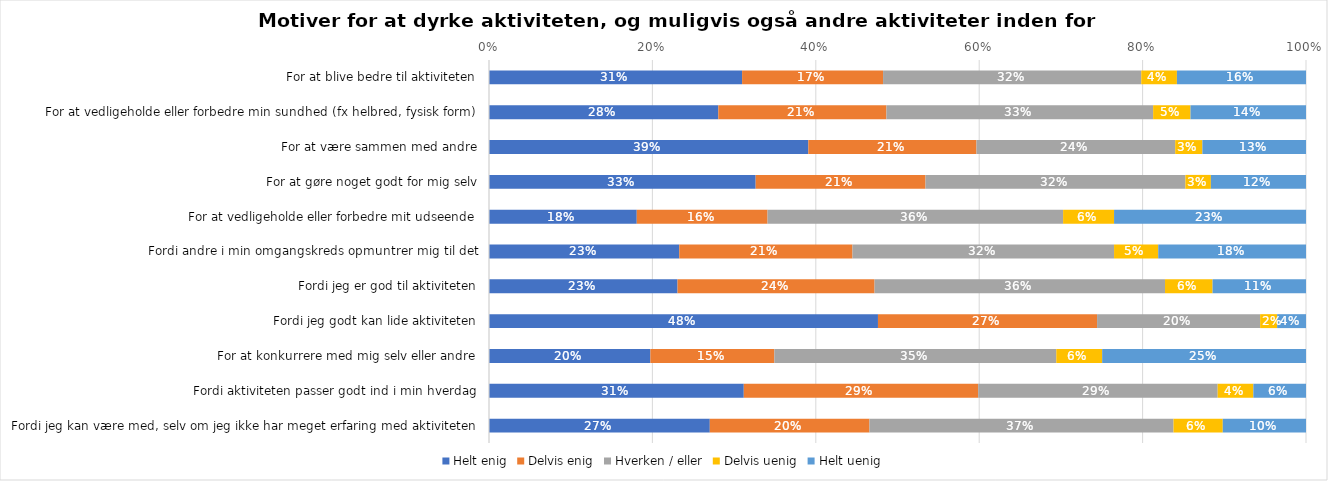
| Category | Helt enig | Delvis enig | Hverken / eller | Delvis uenig | Helt uenig |
|---|---|---|---|---|---|
| For at blive bedre til aktiviteten | 0.31 | 0.173 | 0.316 | 0.044 | 0.158 |
| For at vedligeholde eller forbedre min sundhed (fx helbred, fysisk form) | 0.281 | 0.206 | 0.326 | 0.046 | 0.141 |
| For at være sammen med andre | 0.391 | 0.206 | 0.243 | 0.033 | 0.127 |
| For at gøre noget godt for mig selv | 0.326 | 0.208 | 0.318 | 0.031 | 0.116 |
| For at vedligeholde eller forbedre mit udseende | 0.181 | 0.16 | 0.362 | 0.062 | 0.235 |
| Fordi andre i min omgangskreds opmuntrer mig til det | 0.233 | 0.212 | 0.32 | 0.054 | 0.181 |
| Fordi jeg er god til aktiviteten | 0.231 | 0.241 | 0.356 | 0.058 | 0.114 |
| Fordi jeg godt kan lide aktiviteten | 0.476 | 0.268 | 0.2 | 0.021 | 0.035 |
| For at konkurrere med mig selv eller andre | 0.198 | 0.152 | 0.345 | 0.056 | 0.249 |
| Fordi aktiviteten passer godt ind i min hverdag | 0.312 | 0.287 | 0.293 | 0.044 | 0.064 |
| Fordi jeg kan være med, selv om jeg ikke har meget erfaring med aktiviteten | 0.27 | 0.195 | 0.372 | 0.06 | 0.102 |